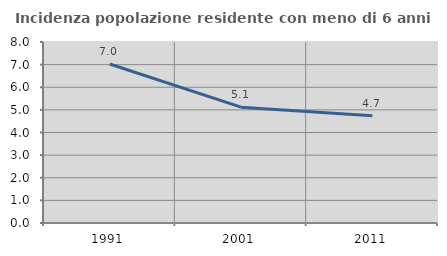
| Category | Incidenza popolazione residente con meno di 6 anni |
|---|---|
| 1991.0 | 7.028 |
| 2001.0 | 5.12 |
| 2011.0 | 4.744 |